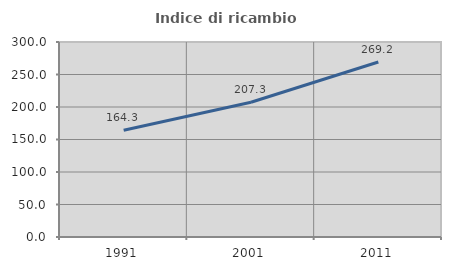
| Category | Indice di ricambio occupazionale  |
|---|---|
| 1991.0 | 164.31 |
| 2001.0 | 207.252 |
| 2011.0 | 269.2 |